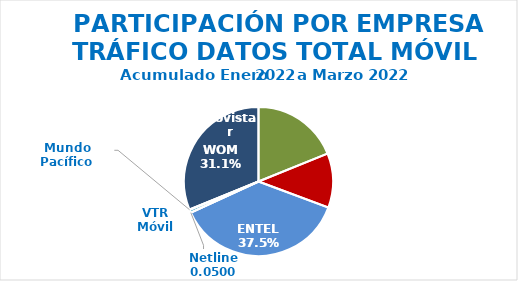
| Category | Series 0 |
|---|---|
| Movistar | 208622.18 |
| Claro | 130342.216 |
| ENTEL | 413873.695 |
| Netline | 0 |
| VTR Móvil | 7099.525 |
| Mundo Pacífico | 975.993 |
| WOM | 344055.556 |